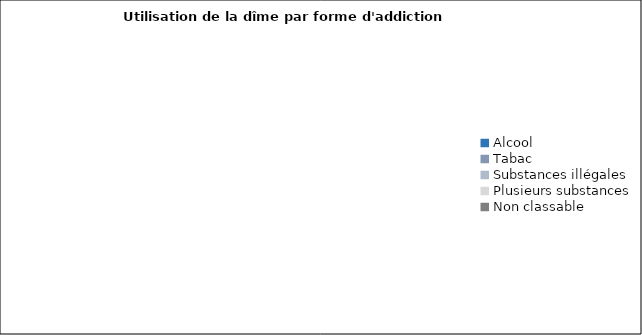
| Category | Series 0 |
|---|---|
| Alcool | 0 |
| Tabac | 0 |
| Substances illégales | 0 |
| Plusieurs substances | 0 |
| Non classable | 0 |